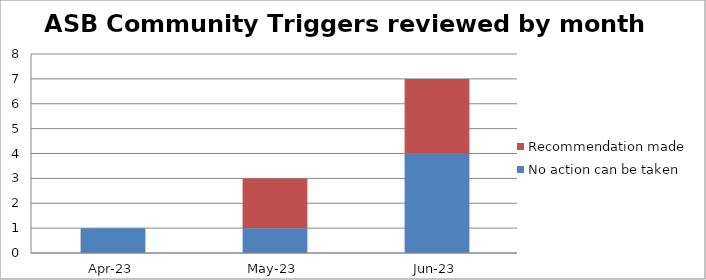
| Category | No action can be taken | Recommendation made |
|---|---|---|
| 2023-04-01 | 1 | 0 |
| 2023-05-01 | 1 | 2 |
| 2023-06-01 | 4 | 3 |